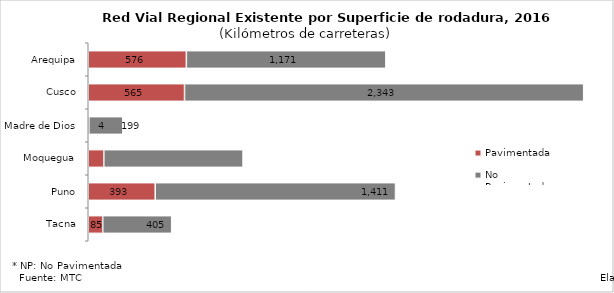
| Category | Pavimentada | No Pavimentada |
|---|---|---|
|  Arequipa | 576.013 | 1171.476 |
|  Cusco | 565.33 | 2343.229 |
|  Madre de Dios | 3.673 | 199.467 |
|  Moquegua | 91.377 | 817.556 |
|  Puno | 393.208 | 1410.682 |
|  Tacna | 85.002 | 404.701 |